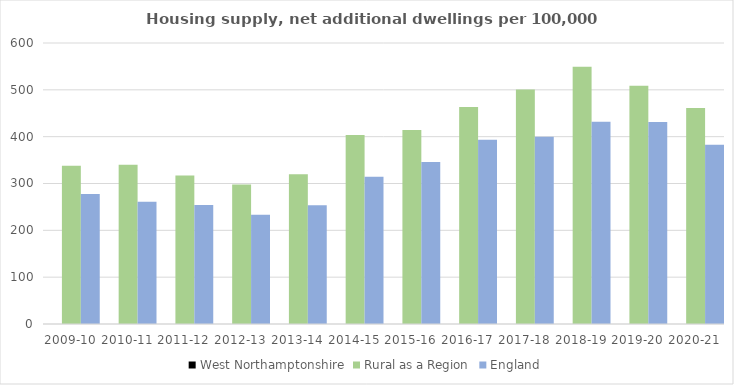
| Category | West Northamptonshire | Rural as a Region | England |
|---|---|---|---|
| 2009-10 |  | 337.852 | 277.548 |
| 2010-11 |  | 340.105 | 260.994 |
| 2011-12 |  | 317.04 | 254.007 |
| 2012-13 |  | 297.763 | 233.153 |
| 2013-14 |  | 319.835 | 253.602 |
| 2014-15 |  | 403.796 | 314.256 |
| 2015-16 |  | 414.091 | 346.154 |
| 2016-17 |  | 463.209 | 393.256 |
| 2017-18 |  | 500.68 | 399.646 |
| 2018-19 |  | 549.491 | 432.099 |
| 2019-20 |  | 508.493 | 431.187 |
| 2020-21 |  | 461.114 | 382.827 |